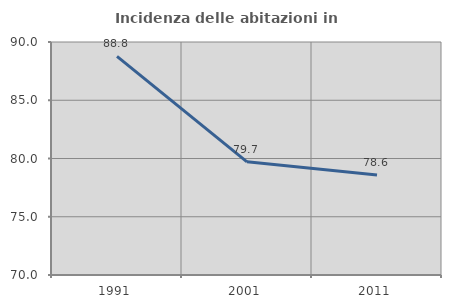
| Category | Incidenza delle abitazioni in proprietà  |
|---|---|
| 1991.0 | 88.77 |
| 2001.0 | 79.714 |
| 2011.0 | 78.593 |